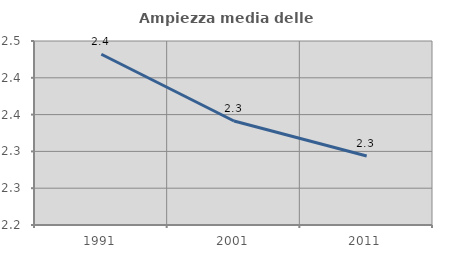
| Category | Ampiezza media delle famiglie |
|---|---|
| 1991.0 | 2.432 |
| 2001.0 | 2.341 |
| 2011.0 | 2.294 |